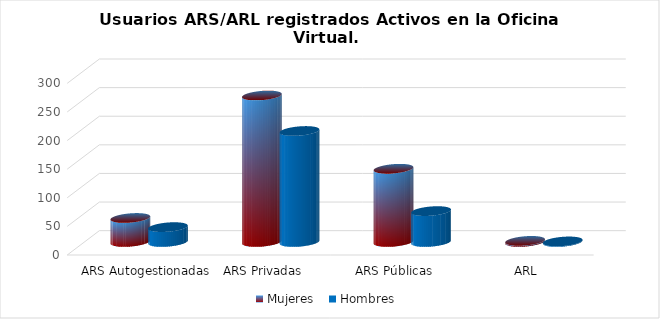
| Category | Mujeres | Hombres |
|---|---|---|
| ARS Autogestionadas | 42 | 26 |
| ARS Privadas | 256 | 194 |
| ARS Públicas | 128 | 54 |
| ARL | 2 | 1 |